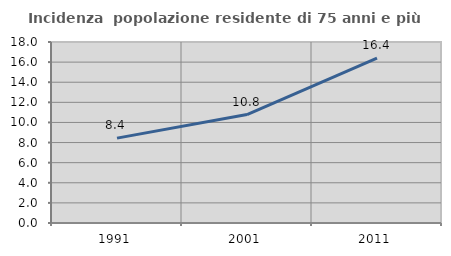
| Category | Incidenza  popolazione residente di 75 anni e più |
|---|---|
| 1991.0 | 8.44 |
| 2001.0 | 10.784 |
| 2011.0 | 16.407 |